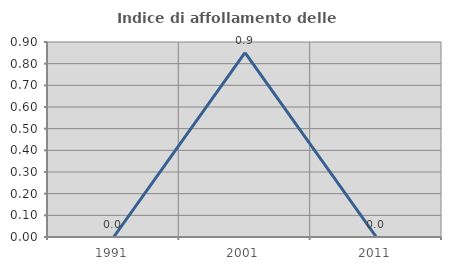
| Category | Indice di affollamento delle abitazioni  |
|---|---|
| 1991.0 | 0 |
| 2001.0 | 0.851 |
| 2011.0 | 0 |